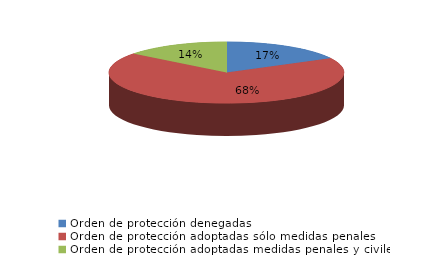
| Category | Series 0 |
|---|---|
| Orden de protección denegadas | 43 |
| Orden de protección adoptadas sólo medidas penales | 171 |
| Orden de protección adoptadas medidas penales y civiles | 36 |